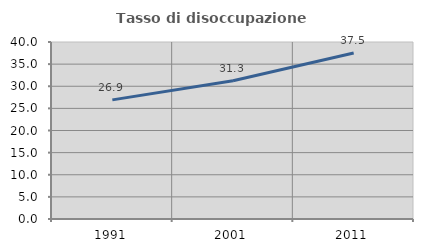
| Category | Tasso di disoccupazione giovanile  |
|---|---|
| 1991.0 | 26.923 |
| 2001.0 | 31.25 |
| 2011.0 | 37.5 |